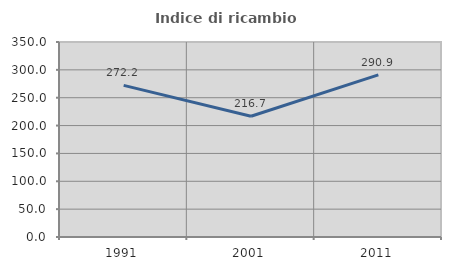
| Category | Indice di ricambio occupazionale  |
|---|---|
| 1991.0 | 272.222 |
| 2001.0 | 216.667 |
| 2011.0 | 290.909 |